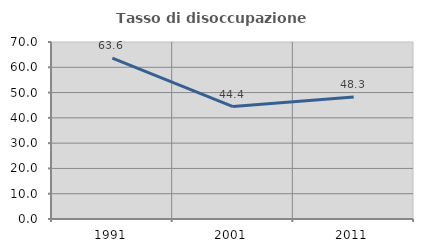
| Category | Tasso di disoccupazione giovanile  |
|---|---|
| 1991.0 | 63.636 |
| 2001.0 | 44.444 |
| 2011.0 | 48.276 |